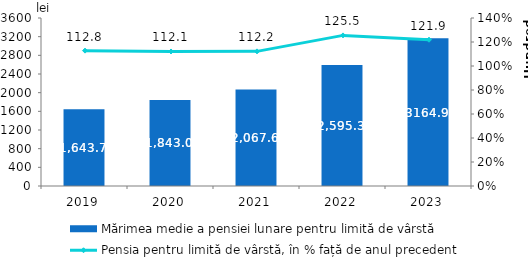
| Category | Mărimea medie a pensiei lunare pentru limită de vârstă |
|---|---|
| 2019.0 | 1643.7 |
| 2020.0 | 1843 |
| 2021.0 | 2067.6 |
| 2022.0 | 2595.3 |
| 2023.0 | 3164.9 |